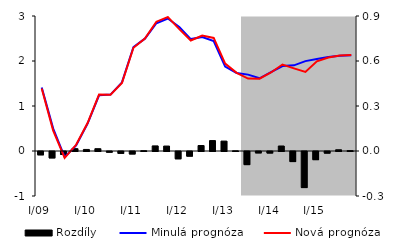
| Category | Rozdíly |
|---|---|
| 0 | -0.022 |
| 1 | -0.043 |
| 2 | -0.02 |
| 3 | 0.016 |
| 4 | 0.01 |
| 5 | 0.015 |
| 6 | -0.005 |
| 7 | -0.012 |
| 8 | -0.017 |
| 9 | 0.002 |
| 10 | 0.034 |
| 11 | 0.033 |
| 12 | -0.049 |
| 13 | -0.031 |
| 14 | 0.037 |
| 15 | 0.069 |
| 16 | 0.066 |
| 17 | 0.001 |
| 18 | -0.087 |
| 19 | -0.009 |
| 20 | -0.01 |
| 21 | 0.033 |
| 22 | -0.067 |
| 23 | -0.24 |
| 24 | -0.054 |
| 25 | -0.011 |
| 26 | 0.008 |
| 27 | 0.002 |